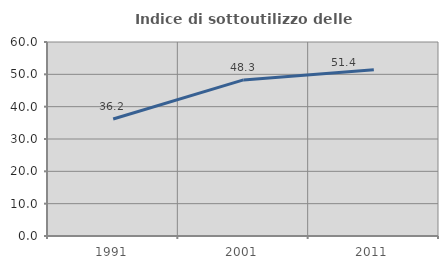
| Category | Indice di sottoutilizzo delle abitazioni  |
|---|---|
| 1991.0 | 36.204 |
| 2001.0 | 48.273 |
| 2011.0 | 51.39 |